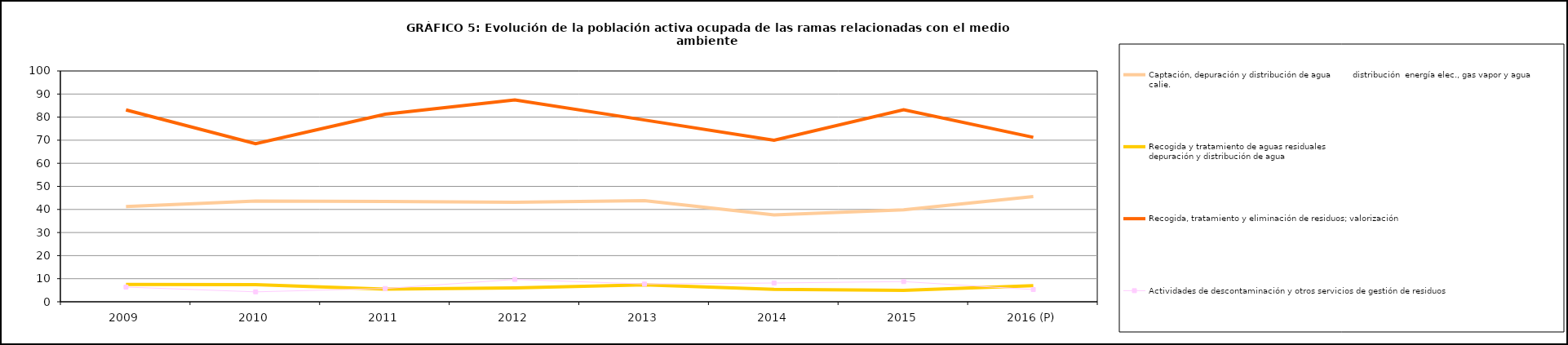
| Category | Captación, depuración y distribución de agua         distribución  energía elec., gas vapor y agua calie. | Recogida y tratamiento de aguas residuales                                                                                 depuración y distribución de agua | Recogida, tratamiento y eliminación de residuos; valorización       | Actividades de descontaminación y otros servicios de gestión de residuos  |
|---|---|---|---|---|
| 2009 | 41.25 | 7.525 | 83.125 | 6.375 |
| 2010 | 43.675 | 7.425 | 68.45 | 4.3 |
| 2011 | 43.425 | 5.5 | 81.275 | 5.75 |
| 2012 | 43.1 | 6.05 | 87.45 | 9.675 |
| 2013 | 43.8 | 7.3 | 78.75 | 7.7 |
| 2014 | 37.675 | 5.35 | 70 | 8.125 |
| 2015 | 39.85 | 4.975 | 83.225 | 8.75 |
| 2016 (P) | 45.6 | 7 | 71.25 | 5.3 |